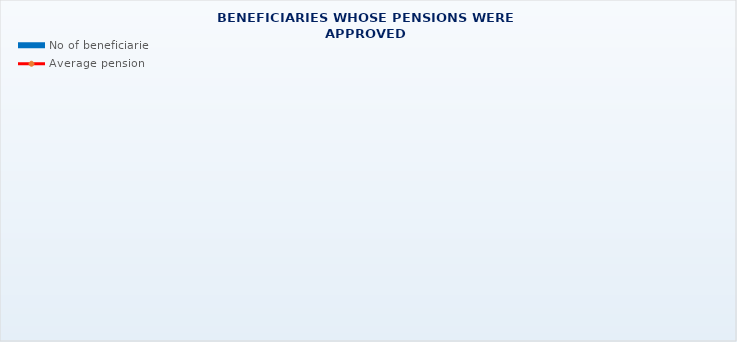
| Category | No of beneficiaries |
|---|---|
| Authorised officials in internal affairs, judicial officers and workers engaged in demining work: | 17264 |
| Pension beneficiaries entitled under the Fire Services Act (Official Gazette 125/19)* | 165 |
| Active military personnel - DVO  | 15906 |
| Croatian Homeland Army veterans mobilised from 1941 to 1945 | 2876 |
| Former political prisoners | 2468 |
| Croatian Veterans from the Homeland War - ZOHBDR (Act on Croatian Homeland War Veterans and Their Family Members) | 70826 |
| Pensions approved under general regulations and determined according to the Act on the Rights of Croatian Homeland War Veterans and their Family Members (ZOHBDR), in 2017 (Art. 27, 35, 48 and 49, paragraph 2)    | 49587 |
| Former Yugoslav People's Army members - JNA   | 4557 |
| Former Yugoslav People's Army members - JNA - Art. 185 of Pension Insurance Act (ZOMO)  | 160 |
| National Liberation War veterans - NOR | 7161 |
| Members of the Croatian Parliament, members of the Government, judges of the Constitutional Court and the Auditor General | 687 |
| Members of the Parliamentary Executive Council and administratively retired federal civil servants  (relates to the former SFRY) | 76 |
| Former officials of federal bodies o the former SFRJ -  Article 38 of the Pension Insurance Act (ZOMO) | 28 |
| Full members of the Croatian Academy of Sciences and Arts - HAZU | 133 |
| Miners from the Istrian coal mines "Tupljak" d.d. Labin  | 245 |
| Workers professionally exposed to asbestos | 855 |
| Insurees - crew members on a ship in international and national navigation  - Article  129, paragraph 2 of the Maritime Code | 195 |
| Members of the Croatian Defence Council - HVO  | 6771 |